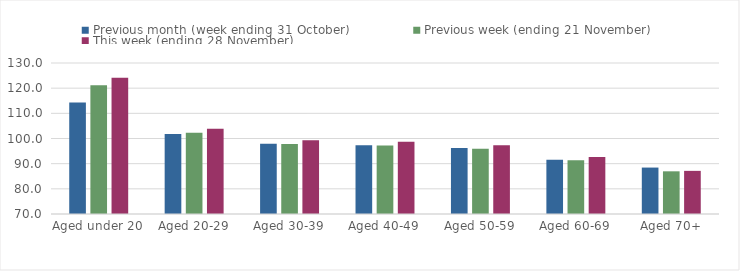
| Category | Previous month (week ending 31 October) | Previous week (ending 21 November) | This week (ending 28 November) |
|---|---|---|---|
| Aged under 20 | 114.27 | 121.15 | 124.09 |
| Aged 20-29 | 101.75 | 102.29 | 103.89 |
| Aged 30-39 | 97.93 | 97.85 | 99.28 |
| Aged 40-49 | 97.32 | 97.21 | 98.7 |
| Aged 50-59 | 96.26 | 95.91 | 97.36 |
| Aged 60-69 | 91.58 | 91.37 | 92.66 |
| Aged 70+ | 88.45 | 86.96 | 87.14 |